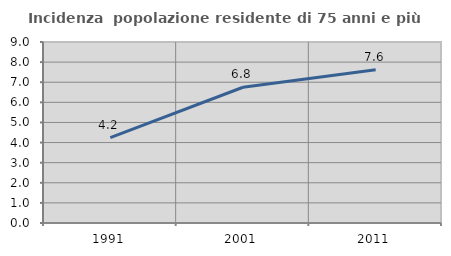
| Category | Incidenza  popolazione residente di 75 anni e più |
|---|---|
| 1991.0 | 4.247 |
| 2001.0 | 6.75 |
| 2011.0 | 7.625 |